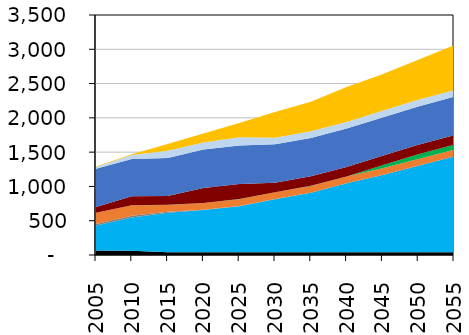
| Category | Series 1 | Series 0 | Series 2 | Series 3 | Series 4 | Series 5 | Series 6 | Series 7 | Series 8 | Series 9 | Series 10 | Series 11 | Series 12 |
|---|---|---|---|---|---|---|---|---|---|---|---|---|---|
| 2005.0 | 0 | 65.07 | 0 | 364.65 | 23.57 | 161.43 | 0 | 0 | 2.53 | 81.05 | 560.28 | 25.71 | 6.34 |
| 2010.0 | 0 | 61.44 | 0 | 484.88 | 25.53 | 152.17 | 0 | 0.07 | 2.53 | 130.31 | 544.79 | 55.15 | 12.38 |
| 2015.0 | 0 | 39.16 | 0 | 575.31 | 17.55 | 97.24 | 0 | 0.07 | 2.53 | 130.31 | 553.87 | 103.01 | 98.2 |
| 2020.0 | 0 | 38.52 | 0 | 617.46 | 3.51 | 97.24 | 0 | 0.07 | 2.53 | 219.05 | 560.28 | 103.01 | 131.58 |
| 2025.0 | 0 | 38.52 | 0 | 672.64 | 3.51 | 97.24 | 0 | 0.07 | 5.67 | 219.05 | 560.28 | 121.56 | 205.95 |
| 2030.0 | 0 | 38.52 | 0 | 774.05 | 3.51 | 97.24 | 0 | 0.01 | 2.53 | 138 | 560.28 | 95.85 | 376.23 |
| 2035.0 | 0 | 38.52 | 0 | 868.9 | 2.04 | 97.24 | 0 | 0.01 | 2.53 | 138 | 560.28 | 95.85 | 433.14 |
| 2040.0 | 0 | 38.52 | 0 | 1007.66 | 0.12 | 97.24 | 0 | 0.01 | 2.53 | 138 | 560.28 | 95.85 | 508.08 |
| 2045.0 | 0 | 38.52 | 0 | 1128.62 | 0.16 | 97.25 | 0 | 0.32 | 43.69 | 138 | 560.28 | 95.85 | 534.95 |
| 2050.0 | 0 | 38.52 | 0 | 1262.95 | 0.03 | 97.25 | 0 | 0.65 | 69.67 | 138 | 560.28 | 95.85 | 582.5 |
| 2055.0 | 0 | 38.52 | 0 | 1399.67 | 0.03 | 97.24 | 0 | 1.36 | 72.38 | 138 | 560.28 | 95.85 | 653.97 |